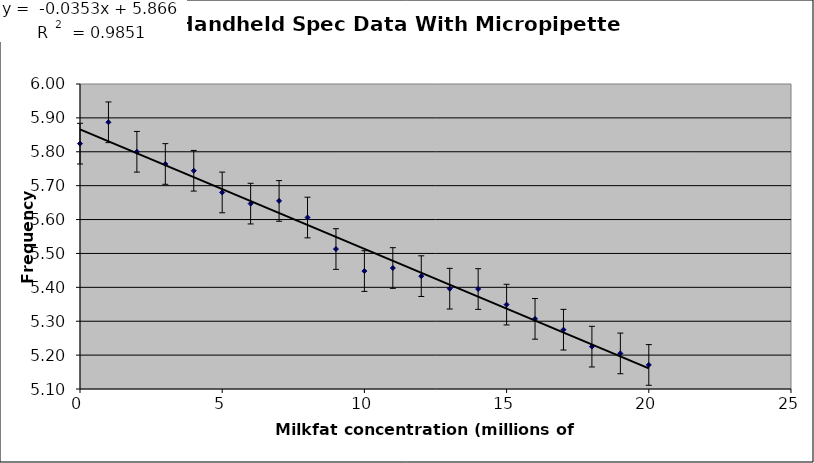
| Category | Handheld Spec Frequency          (khz) |
|---|---|
| 0.0 | 5.824 |
| 1.0 | 5.887 |
| 2.0 | 5.8 |
| 3.0 | 5.764 |
| 4.0 | 5.744 |
| 5.0 | 5.68 |
| 6.0 | 5.647 |
| 7.0 | 5.655 |
| 8.0 | 5.606 |
| 9.0 | 5.513 |
| 10.0 | 5.448 |
| 11.0 | 5.457 |
| 12.0 | 5.433 |
| 13.0 | 5.396 |
| 14.0 | 5.395 |
| 15.0 | 5.349 |
| 16.0 | 5.307 |
| 17.0 | 5.275 |
| 18.0 | 5.225 |
| 19.0 | 5.205 |
| 20.0 | 5.171 |